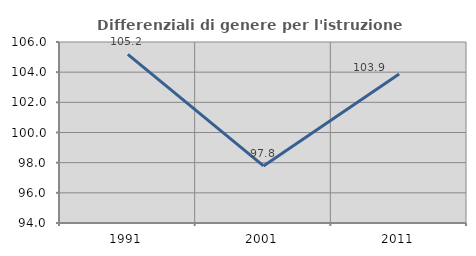
| Category | Differenziali di genere per l'istruzione superiore |
|---|---|
| 1991.0 | 105.174 |
| 2001.0 | 97.784 |
| 2011.0 | 103.872 |